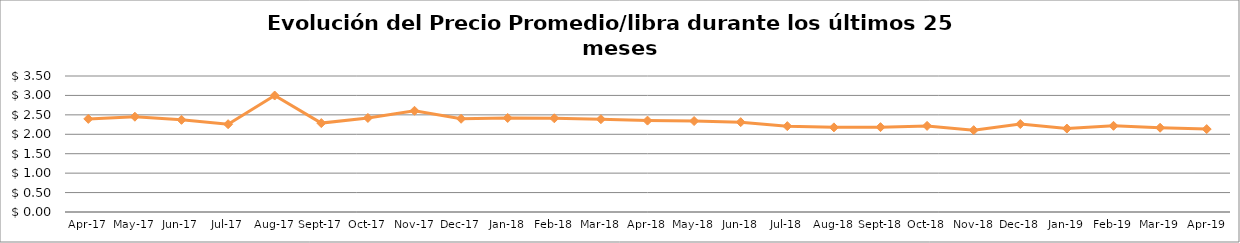
| Category | Series 0 |
|---|---|
| 2017-04-01 | 2.396 |
| 2017-05-01 | 2.452 |
| 2017-06-01 | 2.372 |
| 2017-07-01 | 2.26 |
| 2017-08-01 | 2.997 |
| 2017-09-01 | 2.288 |
| 2017-10-01 | 2.421 |
| 2017-11-01 | 2.605 |
| 2017-12-01 | 2.4 |
| 2018-01-01 | 2.42 |
| 2018-02-01 | 2.412 |
| 2018-03-01 | 2.388 |
| 2018-04-01 | 2.352 |
| 2018-05-01 | 2.341 |
| 2018-06-01 | 2.312 |
| 2018-07-01 | 2.209 |
| 2018-08-01 | 2.178 |
| 2018-09-01 | 2.184 |
| 2018-10-01 | 2.216 |
| 2018-11-01 | 2.106 |
| 2018-12-01 | 2.264 |
| 2019-01-01 | 2.147 |
| 2019-02-01 | 2.218 |
| 2019-03-01 | 2.169 |
| 2019-04-01 | 2.134 |